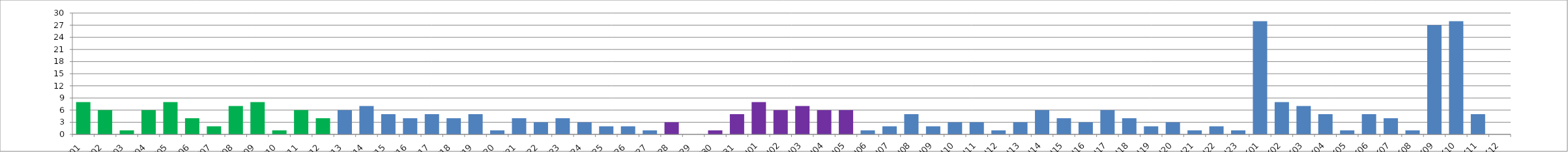
| Category | Series 0 |
|---|---|
| W01 | 8 |
| W02 | 6 |
| W03 | 1 |
| W04 | 6 |
| W05 | 8 |
| W06 | 4 |
| W07 | 2 |
| W08 | 7 |
| W09 | 8 |
| W10 | 1 |
| W11 | 6 |
| W12 | 4 |
| W13 | 6 |
| W14 | 7 |
| W15 | 5 |
| W16 | 4 |
| W17 | 5 |
| W18 | 4 |
| W19 | 5 |
| W20 | 1 |
| W21 | 4 |
| W22 | 3 |
| W23 | 4 |
| W24 | 3 |
| W25 | 2 |
| W26 | 2 |
| W27 | 1 |
| W28 | 3 |
| W29 | 0 |
| W30 | 1 |
| W31 | 5 |
| U01 | 8 |
| U02 | 6 |
| U03 | 7 |
| U04 | 6 |
| U05 | 6 |
| U06 | 1 |
| U07 | 2 |
| U08 | 5 |
| U09 | 2 |
| U10 | 3 |
| U11 | 3 |
| U12 | 1 |
| U13 | 3 |
| U14 | 6 |
| U15 | 4 |
| U16 | 3 |
| U17 | 6 |
| U18 | 4 |
| U19 | 2 |
| U20 | 3 |
| U21 | 1 |
| U22 | 2 |
| U23 | 1 |
| K01 | 28 |
| K02 | 8 |
| K03 | 7 |
| K04 | 5 |
| K05 | 1 |
| K06 | 5 |
| K07 | 4 |
| K08 | 1 |
| K09 | 27 |
| K10 | 28 |
| K11 | 5 |
| K12 | 0 |